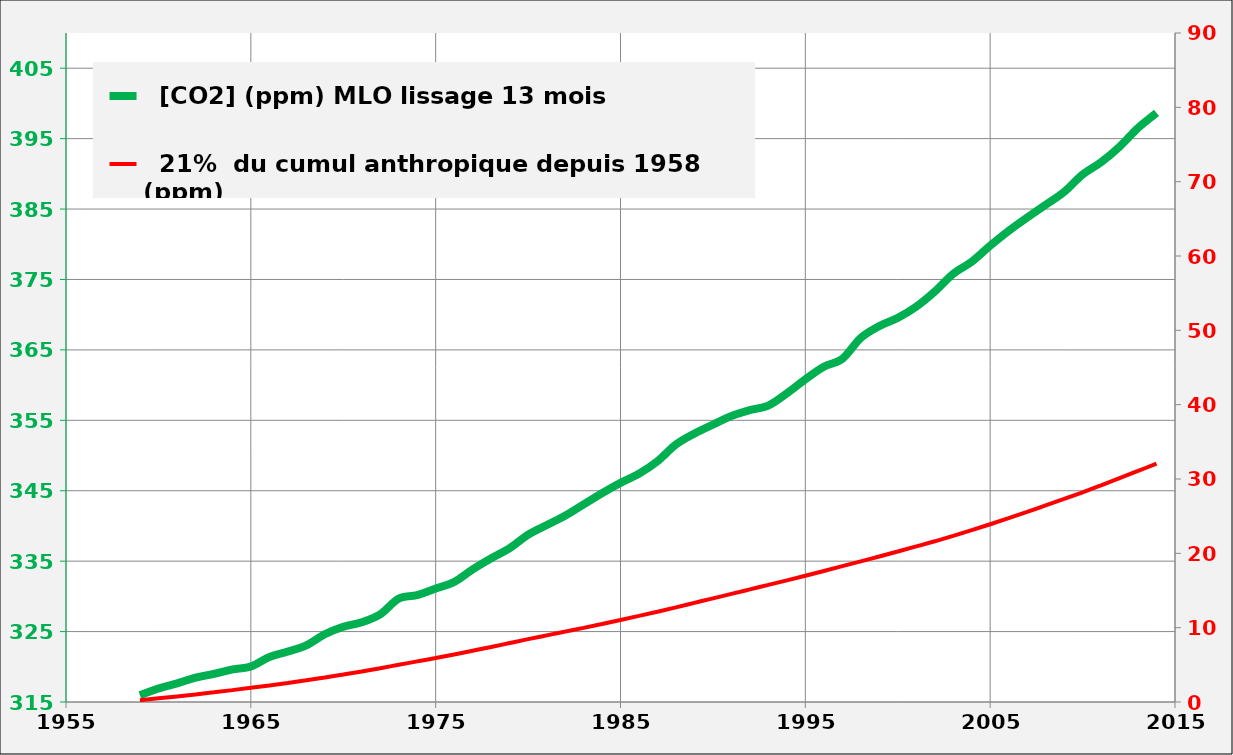
| Category |   [CO2] (ppm) MLO lissage 13 mois |
|---|---|
| 1959.0 | 315.97 |
| 1960.0 | 316.91 |
| 1961.0 | 317.64 |
| 1962.0 | 318.45 |
| 1963.0 | 318.99 |
| 1964.0 | 319.62 |
| 1965.0 | 320.04 |
| 1966.0 | 321.38 |
| 1967.0 | 322.16 |
| 1968.0 | 323.04 |
| 1969.0 | 324.62 |
| 1970.0 | 325.68 |
| 1971.0 | 326.32 |
| 1972.0 | 327.45 |
| 1973.0 | 329.68 |
| 1974.0 | 330.18 |
| 1975.0 | 331.11 |
| 1976.0 | 332.04 |
| 1977.0 | 333.83 |
| 1978.0 | 335.4 |
| 1979.0 | 336.84 |
| 1980.0 | 338.75 |
| 1981.0 | 340.11 |
| 1982.0 | 341.45 |
| 1983.0 | 343.05 |
| 1984.0 | 344.65 |
| 1985.0 | 346.12 |
| 1986.0 | 347.42 |
| 1987.0 | 349.19 |
| 1988.0 | 351.57 |
| 1989.0 | 353.12 |
| 1990.0 | 354.39 |
| 1991.0 | 355.61 |
| 1992.0 | 356.45 |
| 1993.0 | 357.1 |
| 1994.0 | 358.83 |
| 1995.0 | 360.82 |
| 1996.0 | 362.61 |
| 1997.0 | 363.73 |
| 1998.0 | 366.7 |
| 1999.0 | 368.38 |
| 2000.0 | 369.55 |
| 2001.0 | 371.14 |
| 2002.0 | 373.28 |
| 2003.0 | 375.8 |
| 2004.0 | 377.52 |
| 2005.0 | 379.8 |
| 2006.0 | 381.9 |
| 2007.0 | 383.79 |
| 2008.0 | 385.6 |
| 2009.0 | 387.43 |
| 2010.0 | 389.9 |
| 2011.0 | 391.65 |
| 2012.0 | 393.85 |
| 2013.0 | 396.52 |
| 2014.0 | 398.65 |